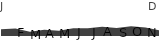
| Category | Series 0 |
|---|---|
| 0 | 0.401 |
| 1 | 0.447 |
| 2 | 0.257 |
| 3 | 0.369 |
| 4 | 0.303 |
| 5 | 0.457 |
| 6 | 0.45 |
| 7 | 0.543 |
| 8 | 0.464 |
| 9 | 0.57 |
| 10 | 0.499 |
| 11 | 0.321 |